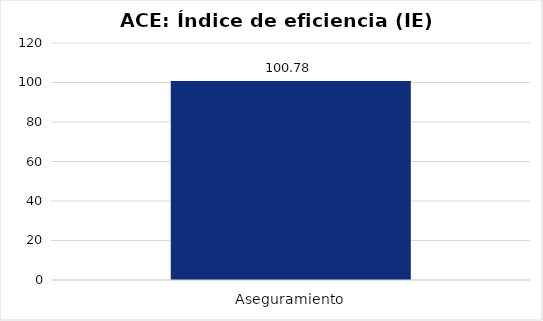
| Category | Índice de eficiencia (IE)  |
|---|---|
| Aseguramiento | 100.784 |